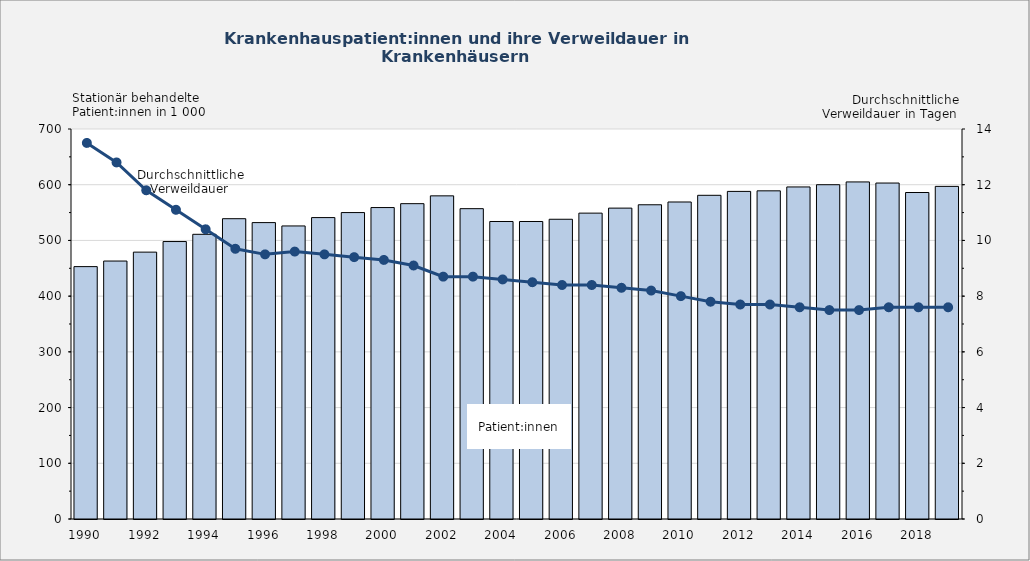
| Category | sationär behandelte Patient:innen in 1000 (linke Skala) |
|---|---|
| 1990.0 | 453 |
| 1991.0 | 463 |
| 1992.0 | 479 |
| 1993.0 | 498 |
| 1994.0 | 511 |
| 1995.0 | 539 |
| 1996.0 | 532 |
| 1997.0 | 526 |
| 1998.0 | 541 |
| 1999.0 | 550 |
| 2000.0 | 559 |
| 2001.0 | 566 |
| 2002.0 | 580 |
| 2003.0 | 557 |
| 2004.0 | 534 |
| 2005.0 | 534 |
| 2006.0 | 538 |
| 2007.0 | 549 |
| 2008.0 | 558 |
| 2009.0 | 564 |
| 2010.0 | 569 |
| 2011.0 | 581 |
| 2012.0 | 588 |
| 2013.0 | 589 |
| 2014.0 | 596 |
| 2015.0 | 600 |
| 2016.0 | 605 |
| 2017.0 | 603 |
| 2018.0 | 586 |
| 2019.0 | 597 |